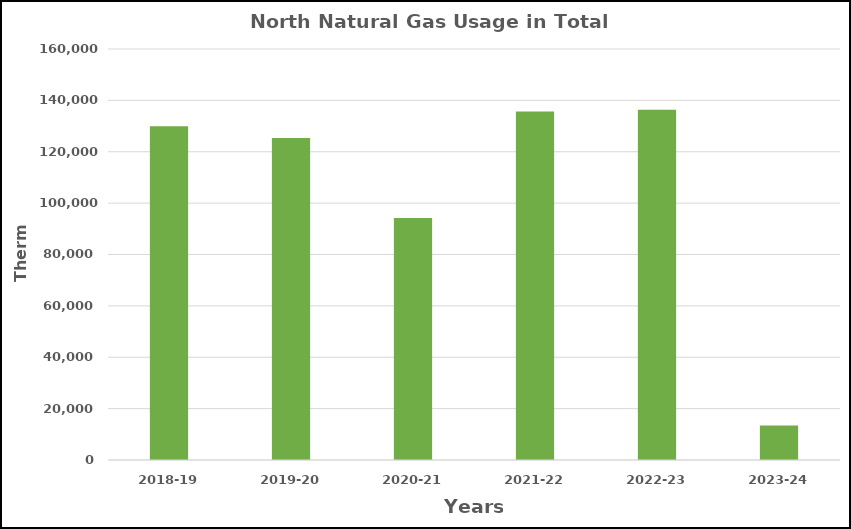
| Category | Series 0 |
|---|---|
| 2018-19 | 129915 |
| 2019-20 | 125314 |
| 2020-21 | 94197 |
| 2021-22 | 135689 |
| 2022-23 | 136350 |
| 2023-24 | 13407 |